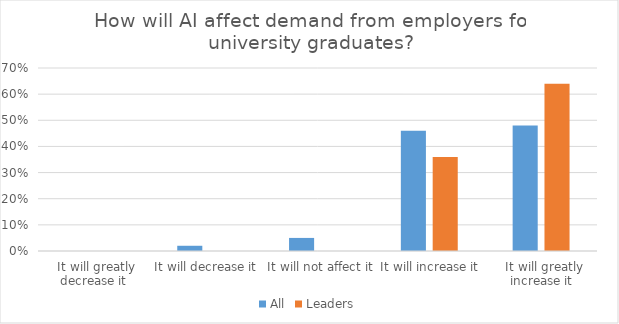
| Category | All | Leaders |
|---|---|---|
|  It will greatly decrease it | 0 | 0 |
|  It will decrease it | 0.02 | 0 |
|  It will not affect it | 0.05 | 0 |
|  It will increase it | 0.46 | 0.36 |
|  It will greatly increase it | 0.48 | 0.64 |